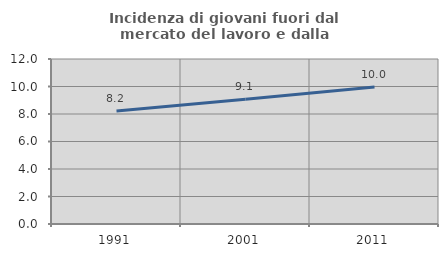
| Category | Incidenza di giovani fuori dal mercato del lavoro e dalla formazione  |
|---|---|
| 1991.0 | 8.22 |
| 2001.0 | 9.077 |
| 2011.0 | 9.955 |